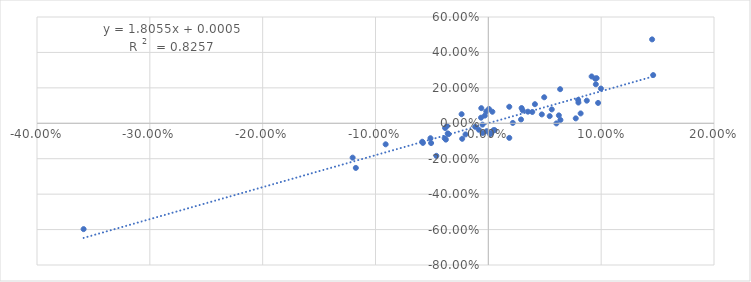
| Category | PETR4-Rf |
|---|---|
| 0.0474061368544819 | 0.05 |
| 0.14514256510155404 | 0.474 |
| 0.06364885978213039 | 0.193 |
| -0.11742518283077417 | -0.252 |
| 0.049515555719728335 | 0.147 |
| 0.09527882105859445 | 0.22 |
| -0.0018415743141535542 | 0.067 |
| -0.003058868287310827 | 0.043 |
| 0.09599231169316241 | 0.255 |
| -0.05796911977661636 | -0.111 |
| -0.03871396687634068 | -0.084 |
| 0.06033100186863436 | -0.001 |
| 0.021699535486311136 | 0.002 |
| -0.03599814288115987 | -0.057 |
| -0.0014259117939344158 | -0.044 |
| -0.05128680852190291 | -0.084 |
| -0.005087589984991325 | -0.055 |
| 0.03894008852239242 | 0.064 |
| 0.06389752662659319 | 0.019 |
| 0.04129247563798365 | 0.108 |
| -0.006229886207783472 | 0.085 |
| -0.03763661266735115 | -0.092 |
| 0.0543702196151091 | 0.04 |
| 0.09977988591669644 | 0.196 |
| 0.0005296881023283675 | 0.081 |
| -0.0051754557175122465 | -0.008 |
| 0.0035715492759713814 | 0.065 |
| -0.12026412568547638 | -0.194 |
| -0.058574562144097904 | -0.104 |
| 0.07961112882666053 | 0.132 |
| -0.038295032868959196 | -0.027 |
| 0.029483229079133737 | 0.086 |
| 0.09156117488454513 | 0.264 |
| 0.018583371244985908 | -0.082 |
| -0.02316426544812525 | -0.088 |
| 0.09727658968486932 | 0.115 |
| -0.023688520272089193 | 0.051 |
| -0.006466143419714733 | 0.032 |
| 0.004607766973708141 | -0.039 |
| 0.0015710712361661052 | -0.061 |
| 0.03508397759564967 | 0.066 |
| 0.002655521127784062 | -0.055 |
| -0.011712749257437385 | -0.02 |
| 0.030441910758014258 | 0.073 |
| 0.018556649482177803 | 0.093 |
| 0.005603855092972939 | -0.039 |
| 0.062492225542115934 | 0.045 |
| -0.02019835357323373 | -0.063 |
| -0.09099399957640653 | -0.119 |
| -0.35869286043615317 | -0.597 |
| 0.0947509979984138 | 0.252 |
| 0.07983649024393698 | 0.117 |
| 0.08181610434729797 | 0.056 |
| 0.07746889786228915 | 0.028 |
| -0.03663381053309614 | -0.016 |
| -0.0507182087377379 | -0.112 |
| -0.00847464399732495 | -0.036 |
| 0.1460855100628553 | 0.272 |
| 0.08725514942691609 | 0.128 |
| -0.03524391562604048 | -0.061 |
| -0.04606462040058036 | -0.184 |
| 0.056227506210689754 | 0.078 |
| 0.028969766799181975 | 0.021 |